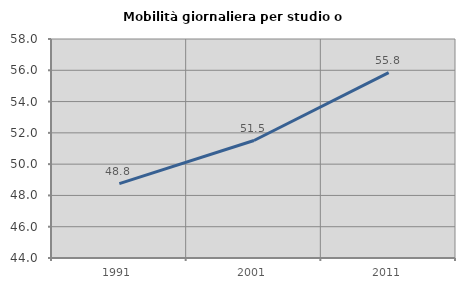
| Category | Mobilità giornaliera per studio o lavoro |
|---|---|
| 1991.0 | 48.754 |
| 2001.0 | 51.511 |
| 2011.0 | 55.85 |